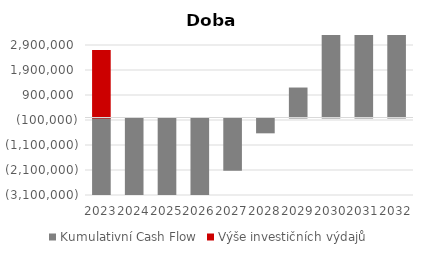
| Category | Kumulativní Cash Flow | Výše investičních výdajů |
|---|---|---|
| 2023 | -4631248.844 | 2700000 |
| 2024 | -4769504.073 | 0 |
| 2025 | -4332405.971 | 0 |
| 2026 | -3392098.274 | 0 |
| 2027 | -2091114.967 | 0 |
| 2028 | -592953.611 | 0 |
| 2029 | 1198913.586 | 0 |
| 2030 | 3335582.57 | 0 |
| 2031 | 5830707.632 | 0 |
| 2032 | 8698391.609 | 0 |